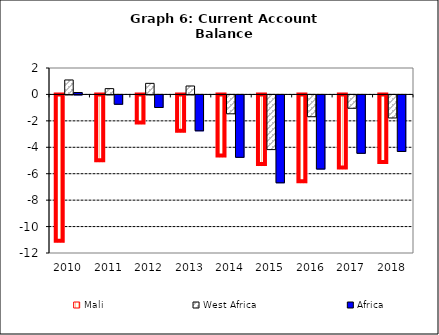
| Category | Mali | West Africa | Africa |
|---|---|---|---|
| 2010.0 | -11.142 | 1.095 | 0.144 |
| 2011.0 | -5.056 | 0.439 | -0.706 |
| 2012.0 | -2.191 | 0.839 | -0.95 |
| 2013.0 | -2.829 | 0.638 | -2.715 |
| 2014.0 | -4.697 | -1.429 | -4.722 |
| 2015.0 | -5.349 | -4.138 | -6.65 |
| 2016.0 | -6.64 | -1.65 | -5.608 |
| 2017.0 | -5.603 | -1.011 | -4.418 |
| 2018.0 | -5.187 | -1.744 | -4.278 |